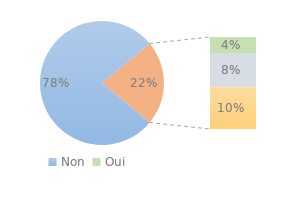
| Category | Series 0 |
|---|---|
| Non | 0.78 |
| Oui | 0.04 |